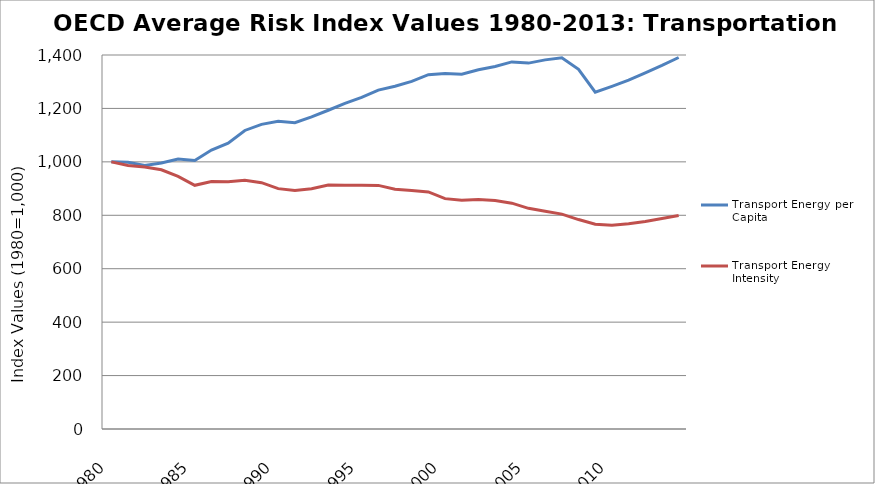
| Category | Transport Energy per Capita | Transport Energy Intensity |
|---|---|---|
| 1980.0 | 1000 | 1000 |
| 1981.0 | 998.533 | 986.739 |
| 1982.0 | 986.845 | 980.649 |
| 1983.0 | 995.96 | 970.359 |
| 1984.0 | 1010.302 | 945.355 |
| 1985.0 | 1005.216 | 912.282 |
| 1986.0 | 1044.083 | 926.766 |
| 1987.0 | 1069.653 | 925.199 |
| 1988.0 | 1117.505 | 930.923 |
| 1989.0 | 1140.439 | 922.058 |
| 1990.0 | 1151.801 | 899.806 |
| 1991.0 | 1146.653 | 892.854 |
| 1992.0 | 1168.273 | 899.233 |
| 1993.0 | 1193.188 | 913.262 |
| 1994.0 | 1219.181 | 912.108 |
| 1995.0 | 1241.556 | 912.339 |
| 1996.0 | 1268.485 | 911.87 |
| 1997.0 | 1283.138 | 897.443 |
| 1998.0 | 1301.344 | 892.951 |
| 1999.0 | 1326.49 | 887.323 |
| 2000.0 | 1330.817 | 862.281 |
| 2001.0 | 1328.238 | 855.856 |
| 2002.0 | 1344.724 | 859.299 |
| 2003.0 | 1356.725 | 855.472 |
| 2004.0 | 1374.123 | 845.277 |
| 2005.0 | 1369.655 | 826.111 |
| 2006.0 | 1381.744 | 814.941 |
| 2007.0 | 1389.585 | 804.347 |
| 2008.0 | 1346.367 | 783.999 |
| 2009.0 | 1260.839 | 766.696 |
| 2010.0 | 1282.637 | 762.757 |
| 2011.0 | 1305.605 | 768.143 |
| 2012.0 | 1333.093 | 776.798 |
| 2013.0 | 1360.909 | 787.695 |
| 2014.0 | 1390.678 | 799.433 |